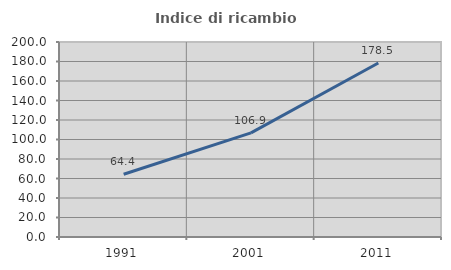
| Category | Indice di ricambio occupazionale  |
|---|---|
| 1991.0 | 64.37 |
| 2001.0 | 106.858 |
| 2011.0 | 178.481 |